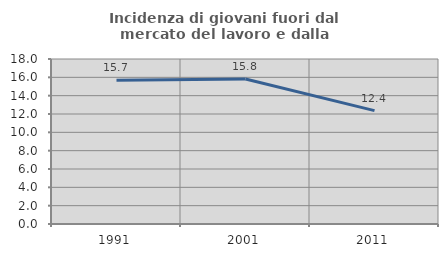
| Category | Incidenza di giovani fuori dal mercato del lavoro e dalla formazione  |
|---|---|
| 1991.0 | 15.69 |
| 2001.0 | 15.823 |
| 2011.0 | 12.368 |